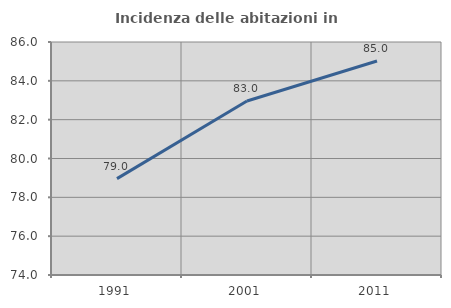
| Category | Incidenza delle abitazioni in proprietà  |
|---|---|
| 1991.0 | 78.963 |
| 2001.0 | 82.961 |
| 2011.0 | 85.021 |